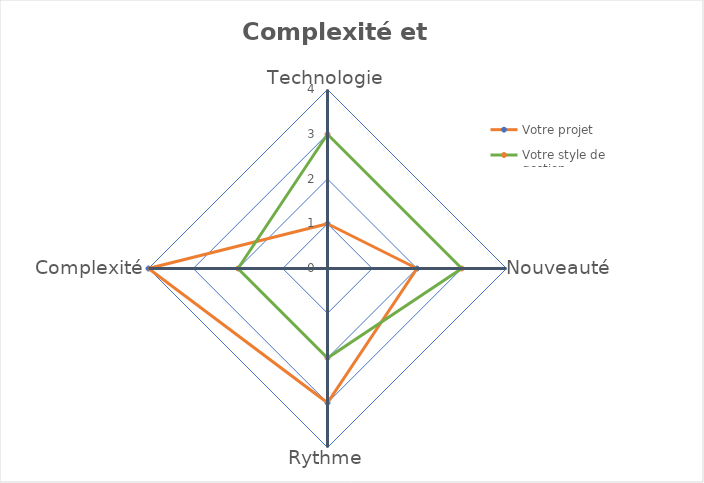
| Category | Votre projet | Votre style de gestion |
|---|---|---|
| Technologie | 1 | 3 |
| Nouveauté | 2 | 3 |
| Rythme | 3 | 2 |
| Complexité | 4 | 2 |